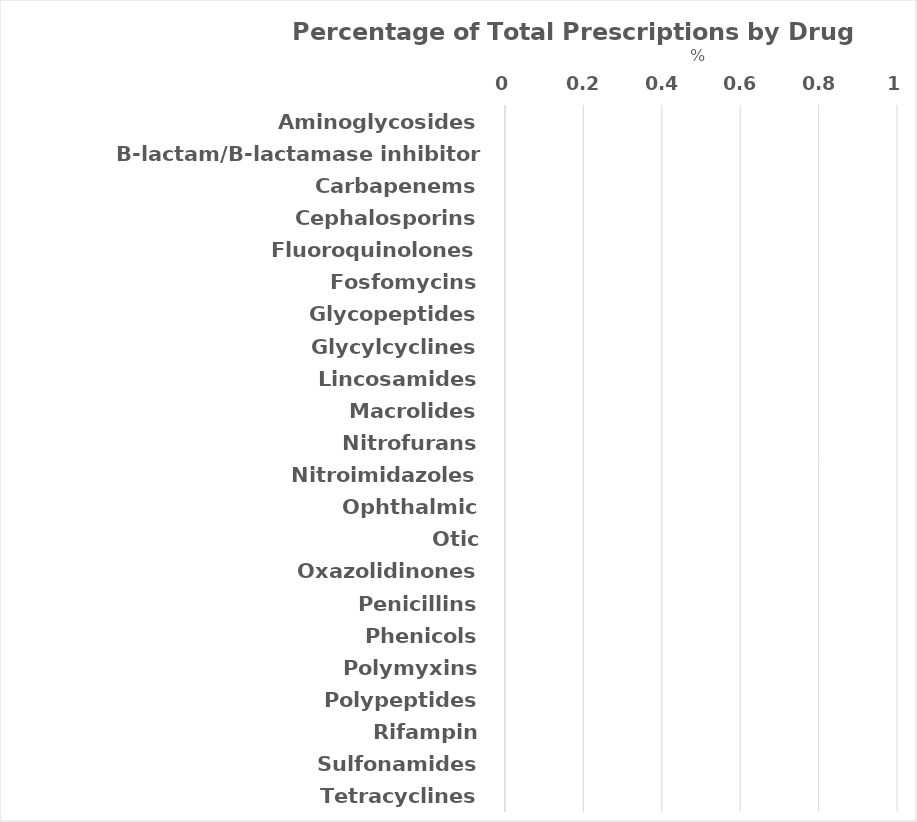
| Category | Series 0 |
|---|---|
| Aminoglycosides | 0 |
| B-lactam/B-lactamase inhibitor combination | 0 |
| Carbapenems | 0 |
| Cephalosporins | 0 |
| Fluoroquinolones | 0 |
| Fosfomycins | 0 |
| Glycopeptides | 0 |
| Glycylcyclines | 0 |
| Lincosamides | 0 |
| Macrolides | 0 |
| Nitrofurans | 0 |
| Nitroimidazoles | 0 |
| Ophthalmic | 0 |
| Otic | 0 |
| Oxazolidinones | 0 |
| Penicillins | 0 |
| Phenicols | 0 |
| Polymyxins | 0 |
| Polypeptides | 0 |
| Rifampin | 0 |
| Sulfonamides | 0 |
| Tetracyclines | 0 |